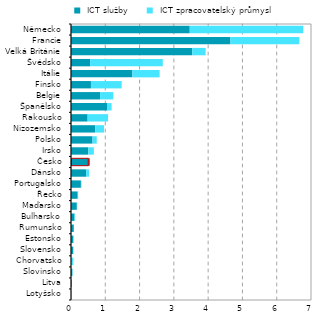
| Category |  ICT služby |  ICT zpracovatelský průmysl |
|---|---|---|
| Lotyšsko | 0.005 | 0.002 |
| Litva | 0.025 | 0.004 |
| Slovinsko | 0.039 | 0.014 |
| Chorvatsko | 0.019 | 0.048 |
| Slovensko | 0.065 | 0.003 |
| Estonsko | 0.066 | 0.016 |
| Rumunsko | 0.082 | 0.001 |
| Bulharsko | 0.103 | 0.015 |
| Maďarsko | 0.17 | 0.011 |
| Řecko | 0.195 | 0.013 |
| Portugalsko | 0.288 | 0.017 |
| Dánsko | 0.441 | 0.084 |
| Česko | 0.503 | 0.023 |
| Irsko | 0.504 | 0.162 |
| Polsko | 0.627 | 0.123 |
| Nizozemsko | 0.707 | 0.257 |
| Rakousko | 0.485 | 0.596 |
| Španělsko | 1.064 | 0.12 |
| Belgie | 0.848 | 0.386 |
| Finsko | 0.582 | 0.896 |
| Itálie | 1.79 | 0.795 |
| Švédsko | 0.56 | 2.118 |
| Velká Británie | 3.535 | 0.392 |
| Francie | 4.65 | 2.01 |
| Německo | 3.464 | 3.311 |